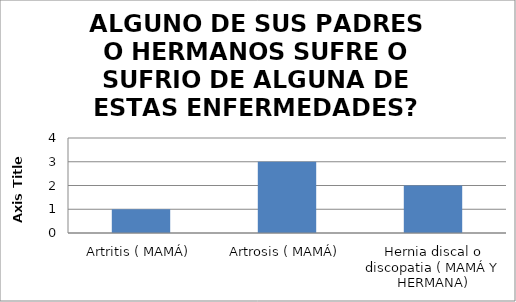
| Category | CANTIDAD DE PERSONAS |
|---|---|
| Artritis ( MAMÁ) | 1 |
| Artrosis ( MAMÁ) | 3 |
| Hernia discal o discopatia ( MAMÁ Y HERMANA) | 2 |